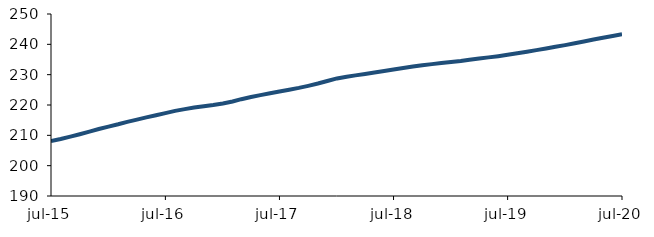
| Category | Series 0 |
|---|---|
| 2015-07-01 | 208.153 |
| 2015-08-01 | 208.792 |
| 2015-09-01 | 209.565 |
| 2015-10-01 | 210.37 |
| 2015-11-01 | 211.212 |
| 2015-12-01 | 212.071 |
| 2016-01-01 | 212.858 |
| 2016-02-01 | 213.636 |
| 2016-03-01 | 214.437 |
| 2016-04-01 | 215.192 |
| 2016-05-01 | 215.912 |
| 2016-06-01 | 216.639 |
| 2016-07-01 | 217.337 |
| 2016-08-01 | 218.055 |
| 2016-09-01 | 218.65 |
| 2016-10-01 | 219.169 |
| 2016-11-01 | 219.609 |
| 2016-12-01 | 220.005 |
| 2017-01-01 | 220.507 |
| 2017-02-01 | 221.16 |
| 2017-03-01 | 221.915 |
| 2017-04-01 | 222.613 |
| 2017-05-01 | 223.245 |
| 2017-06-01 | 223.858 |
| 2017-07-01 | 224.458 |
| 2017-08-01 | 225.032 |
| 2017-09-01 | 225.639 |
| 2017-10-01 | 226.319 |
| 2017-11-01 | 227.091 |
| 2017-12-01 | 227.928 |
| 2018-01-01 | 228.757 |
| 2018-02-01 | 229.33 |
| 2018-03-01 | 229.772 |
| 2018-04-01 | 230.22 |
| 2018-05-01 | 230.681 |
| 2018-06-01 | 231.179 |
| 2018-07-01 | 231.685 |
| 2018-08-01 | 232.189 |
| 2018-09-01 | 232.666 |
| 2018-10-01 | 233.101 |
| 2018-11-01 | 233.479 |
| 2018-12-01 | 233.833 |
| 2019-01-01 | 234.138 |
| 2019-02-01 | 234.495 |
| 2019-03-01 | 234.907 |
| 2019-04-01 | 235.31 |
| 2019-05-01 | 235.703 |
| 2019-06-01 | 236.101 |
| 2019-07-01 | 236.555 |
| 2019-08-01 | 237.038 |
| 2019-09-01 | 237.55 |
| 2019-10-01 | 238.082 |
| 2019-11-01 | 238.622 |
| 2019-12-01 | 239.173 |
| 2020-01-01 | 239.736 |
| 2020-02-01 | 240.361 |
| 2020-03-01 | 240.917 |
| 2020-04-01 | 241.568 |
| 2020-05-01 | 242.157 |
| 2020-06-01 | 242.754 |
| 2020-07-01 | 243.298 |